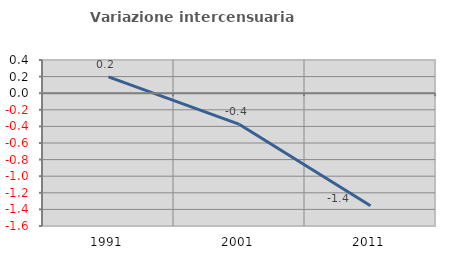
| Category | Variazione intercensuaria annua |
|---|---|
| 1991.0 | 0.196 |
| 2001.0 | -0.376 |
| 2011.0 | -1.356 |